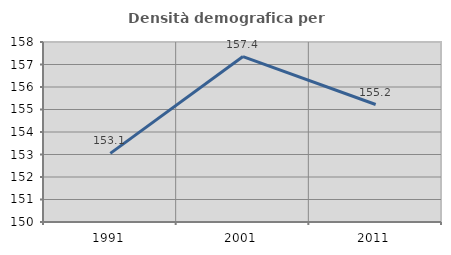
| Category | Densità demografica |
|---|---|
| 1991.0 | 153.052 |
| 2001.0 | 157.352 |
| 2011.0 | 155.222 |